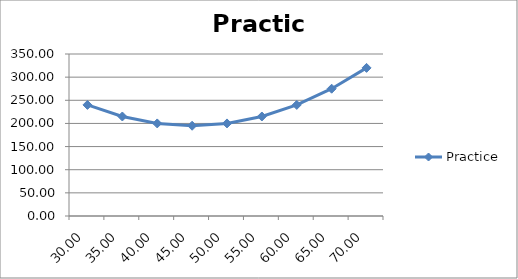
| Category | Practice |
|---|---|
| 30.0 | 240 |
| 35.0 | 215 |
| 40.0 | 200 |
| 45.0 | 195 |
| 50.0 | 200 |
| 55.0 | 215 |
| 60.0 | 240 |
| 65.0 | 275 |
| 70.0 | 320 |